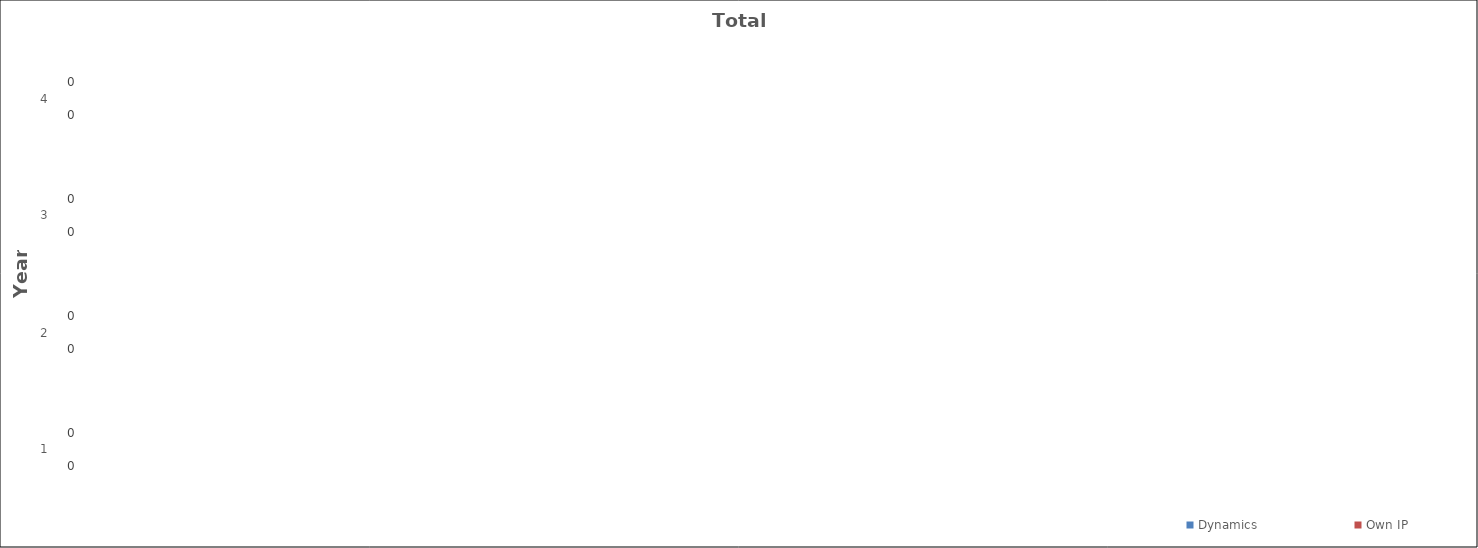
| Category | Dynamics | Own IP |
|---|---|---|
| 1.0 | 0 | 0 |
| 2.0 | 0 | 0 |
| 3.0 | 0 | 0 |
| 4.0 | 0 | 0 |